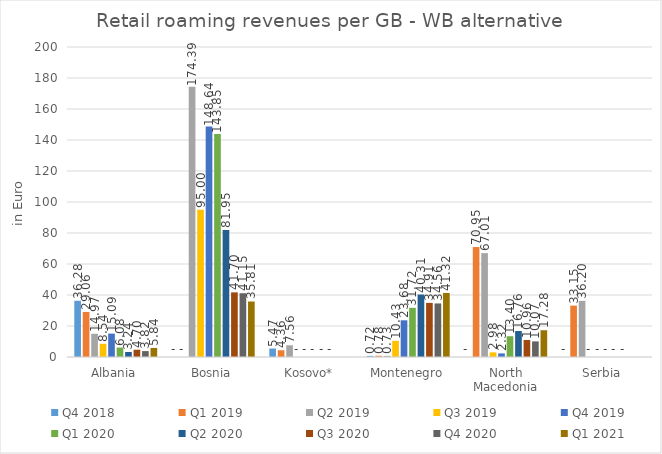
| Category | Q4 2018 | Q1 2019 | Q2 2019 | Q3 2019 | Q4 2019 | Q1 2020 | Q2 2020 | Q3 2020 | Q4 2020 | Q1 2021 |
|---|---|---|---|---|---|---|---|---|---|---|
| Albania | 36.283 | 29.061 | 14.965 | 8.545 | 15.091 | 6.083 | 3.241 | 4.696 | 3.816 | 5.836 |
| Bosnia | 0 | 0 | 174.387 | 95.004 | 148.635 | 143.852 | 81.95 | 41.7 | 41.153 | 35.809 |
| Kosovo* | 5.466 | 4.358 | 7.561 | 0 | 0 | 0 | 0 | 0 | 0 | 0 |
| Montenegro | 0.717 | 0.783 | 0.729 | 10.43 | 23.676 | 31.721 | 40.313 | 34.907 | 34.558 | 41.321 |
| North Macedonia | 0 | 70.947 | 67.011 | 2.978 | 2.317 | 13.395 | 16.761 | 10.961 | 10.074 | 17.282 |
| Serbia | 0 | 33.154 | 36.205 | 0 | 0 | 0 | 0 | 0 | 0 | 0 |